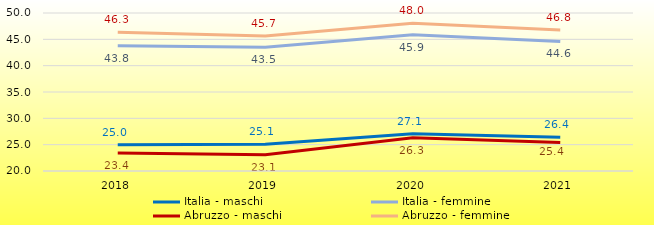
| Category | Italia - maschi | Italia - femmine | Abruzzo - maschi | Abruzzo - femmine |
|---|---|---|---|---|
| 2018 | 24.987 | 43.776 | 23.415 | 46.331 |
| 2019 | 25.072 | 43.485 | 23.08 | 45.653 |
| 2020 | 27.053 | 45.853 | 26.335 | 48.043 |
| 2021 | 26.388 | 44.608 | 25.39 | 46.766 |